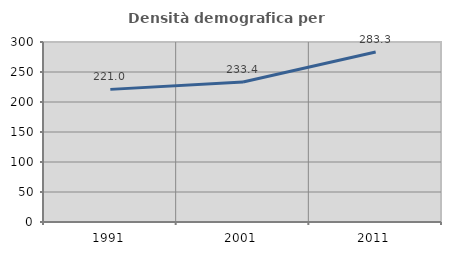
| Category | Densità demografica |
|---|---|
| 1991.0 | 221.042 |
| 2001.0 | 233.44 |
| 2011.0 | 283.327 |